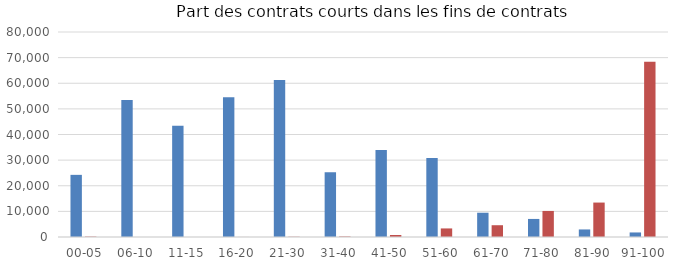
| Category | Recours faible ou modéré | Recours intensif |
|---|---|---|
| 00-05 % | 24251 | 156 |
| 06-10 % | 53491 | 12 |
| 11-15 % | 43387 | 7 |
| 16-20 % | 54511 | 17 |
| 21-30 % | 61230 | 101 |
| 31-40 % | 25297 | 204 |
| 41-50 % | 33953 | 789 |
| 51-60 % | 30830 | 3344 |
| 61-70 % | 9476 | 4596 |
| 71-80 % | 7049 | 10166 |
| 81-90 % | 2949 | 13439 |
| 91-100 % | 1774 | 68369 |